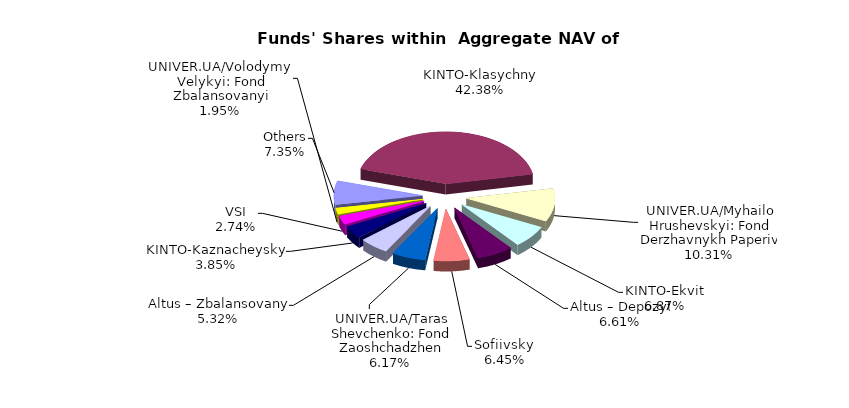
| Category | Series 0 | Series 1 |
|---|---|---|
| Others | 3647887.1 | 0.074 |
| KINTO-Klasychnyi | 21018829.46 | 0.424 |
| UNIVER.UA/Myhailo Hrushevskyi: Fond Derzhavnykh Paperiv | 5113684.42 | 0.103 |
| KINTO-Ekviti | 3408624.32 | 0.069 |
| Altus – Depozyt | 3276025.94 | 0.066 |
| Sofiivskyi | 3199229.646 | 0.065 |
| UNIVER.UA/Taras Shevchenko: Fond Zaoshchadzhen | 3058780.44 | 0.062 |
| Altus – Zbalansovanyi | 2639607.73 | 0.053 |
| KINTO-Kaznacheyskyi | 1907449.23 | 0.038 |
| VSI | 1361002.7 | 0.027 |
| UNIVER.UA/Volodymyr Velykyi: Fond Zbalansovanyi | 967795.06 | 0.02 |